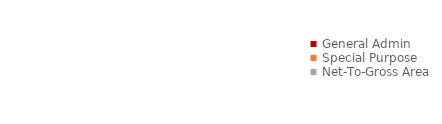
| Category | Series 0 |
|---|---|
| General Admin | 0 |
| Special Purpose | 0 |
| Net-To-Gross Area | 0 |